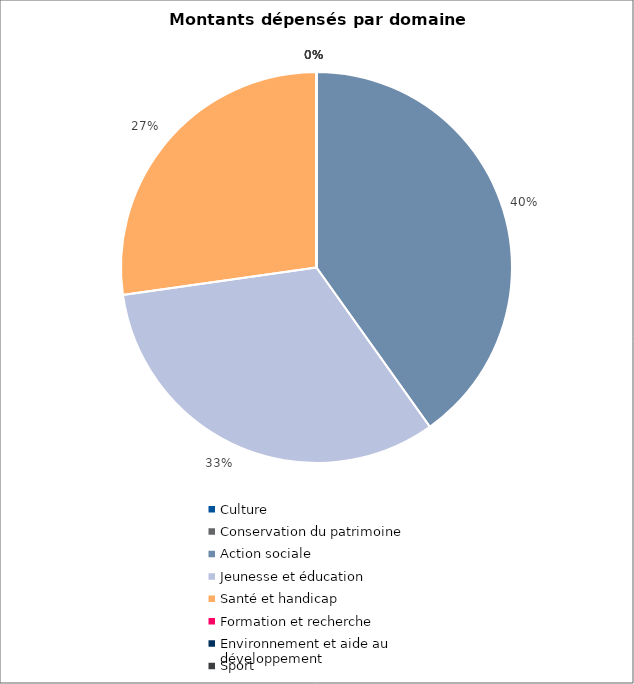
| Category | Series 0 |
|---|---|
| Culture | 0 |
| Conservation du patrimoine | 0 |
| Action sociale | 136131 |
| Jeunesse et éducation | 110551 |
| Santé et handicap | 92395 |
| Formation et recherche | 0 |
| Environnement et aide au
développement | 0 |
| Sport | 0 |
| Autres projets d’utilité publique | 0 |